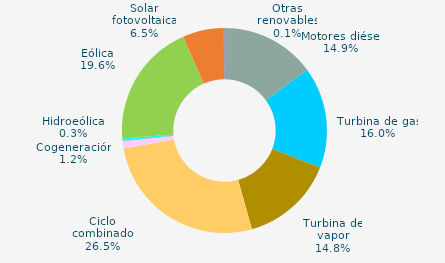
| Category | Series 0 |
|---|---|
| Motores diésel | 14.941 |
| Turbina de gas | 15.956 |
| Turbina de vapor | 14.788 |
| Ciclo combinado | 26.516 |
| Cogeneración | 1.17 |
| Hidráulica | 0.047 |
| Hidroeólica | 0.347 |
| Eólica | 19.621 |
| Solar fotovoltaica | 6.501 |
| Otras renovables | 0.113 |